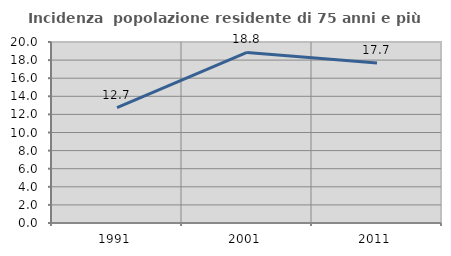
| Category | Incidenza  popolazione residente di 75 anni e più |
|---|---|
| 1991.0 | 12.745 |
| 2001.0 | 18.848 |
| 2011.0 | 17.68 |